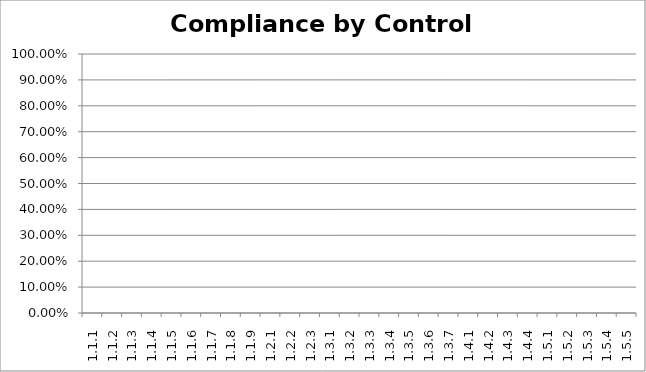
| Category | Compliance |
|---|---|
| 1.1.1 | 0 |
| 1.1.2 | 0 |
| 1.1.3 | 0 |
| 1.1.4 | 0 |
| 1.1.5 | 0 |
| 1.1.6 | 0 |
| 1.1.7 | 0 |
| 1.1.8 | 0 |
| 1.1.9 | 0 |
| 1.2.1 | 0 |
| 1.2.2 | 0 |
| 1.2.3 | 0 |
| 1.3.1 | 0 |
| 1.3.2 | 0 |
| 1.3.3 | 0 |
| 1.3.4 | 0 |
| 1.3.5 | 0 |
| 1.3.6 | 0 |
| 1.3.7 | 0 |
| 1.4.1 | 0 |
| 1.4.2 | 0 |
| 1.4.3 | 0 |
| 1.4.4 | 0 |
| 1.5.1 | 0 |
| 1.5.2 | 0 |
| 1.5.3 | 0 |
| 1.5.4 | 0 |
| 1.5.5 | 0 |